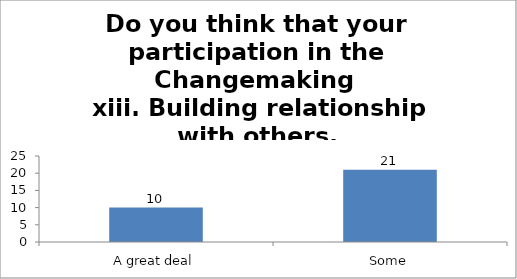
| Category | Do you think that your participation in the Changemaking 
 xiii. Building relationship with others. |
|---|---|
| A great deal | 10 |
| Some | 21 |